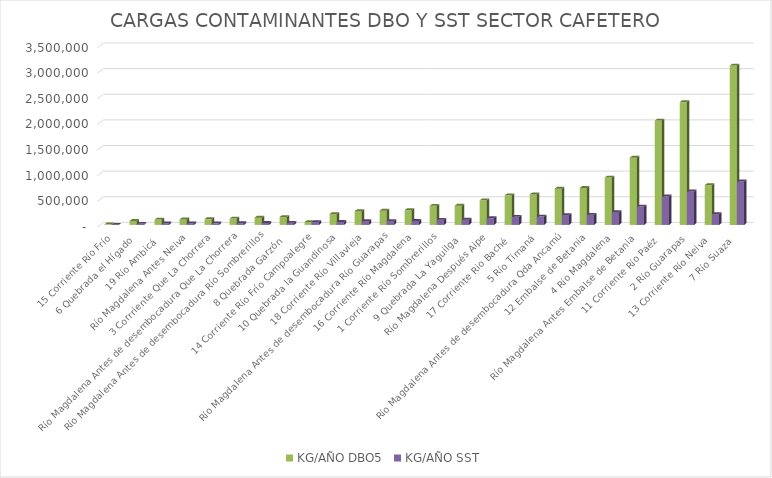
| Category | TON/AÑO DBO5 | TON/AÑO SST | KG/AÑO DBO5 | KG/AÑO SST |
|---|---|---|---|---|
| 15 Corriente Río Frío |  |  | 10884.157 | 2968.406 |
| 6 Quebrada el Hígado |  |  | 77155.896 | 21042.517 |
| 19 Río Ambicá |  |  | 104670.477 | 28546.494 |
|  Río Magdalena Antes Neiva |  |  | 107333.764 | 29272.845 |
| 3 Corrriente Que La Chorrera |  |  | 113331.358 | 30908.552 |
| Río Magdalena Antes de desembocadura Que La Chorrera |  |  | 123375.649 | 33647.904 |
| Río Magdalena Antes de desembocadura Río Sombrerillos |  |  | 142228.256 | 38789.524 |
| 8 Quebrada Garzón |  |  | 154112.291 | 42030.625 |
| 14 Corriente Río Frío Campoalegre |  |  | 56908.47 | 56908.47 |
| 10 Quebrada la Guandinosa |  |  | 213088.232 | 58114.972 |
| 18 Corriente Río Villavieja |  |  | 268830.423 | 73317.388 |
| Río Magdalena Antes de desembocadura Río Guarapas |  |  | 278576.744 | 75975.476 |
| 16 Corriente Río Magdalena |  |  | 289423.081 | 78933.568 |
| 1 Corriente Río Sombrerillos |  |  | 371779.642 | 101394.448 |
| 9 Quebrada La Yaguilga |  |  | 375060.184 | 102289.141 |
| Río Magdalena Después Aipe |  |  | 480046.552 | 130921.787 |
| 17 Corriente Rio Baché |  |  | 577754.24 | 157569.338 |
| 5 Río Timaná |  |  | 595734.115 | 162472.94 |
| Río Magdalena Antes de desembocadura Qda Ancamú |  |  | 707870.175 | 193055.502 |
| 12 Embalse de Betania |  |  | 721910.331 | 196884.636 |
| 4 Río Magdalena |  |  | 924378.285 | 252103.169 |
| Río Magdalena Antes Embalse de Betania |  |  | 1311238.309 | 357610.448 |
| 11 Corriente Río Paéz |  |  | 2035942.784 | 555257.123 |
| 2 Río Guarapas |  |  | 2396091.532 | 653479.509 |
| 13 Corriente Río Neiva |  |  | 777909.933 | 212160 |
| 7 Río Suaza |  |  | 3109487.575 | 848042.066 |